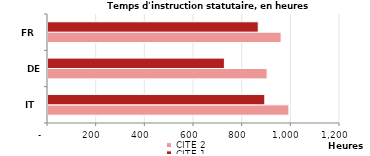
| Category | CITE 2 | CITE 1 |
|---|---|---|
| IT | 990 | 891 |
| DE | 900.423 | 724.94 |
| FR | 958 | 864 |